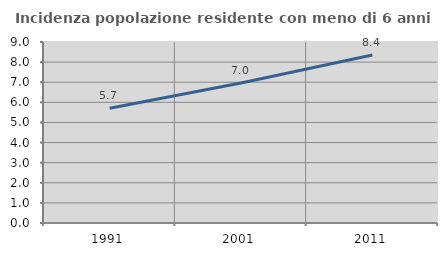
| Category | Incidenza popolazione residente con meno di 6 anni |
|---|---|
| 1991.0 | 5.706 |
| 2001.0 | 6.963 |
| 2011.0 | 8.352 |